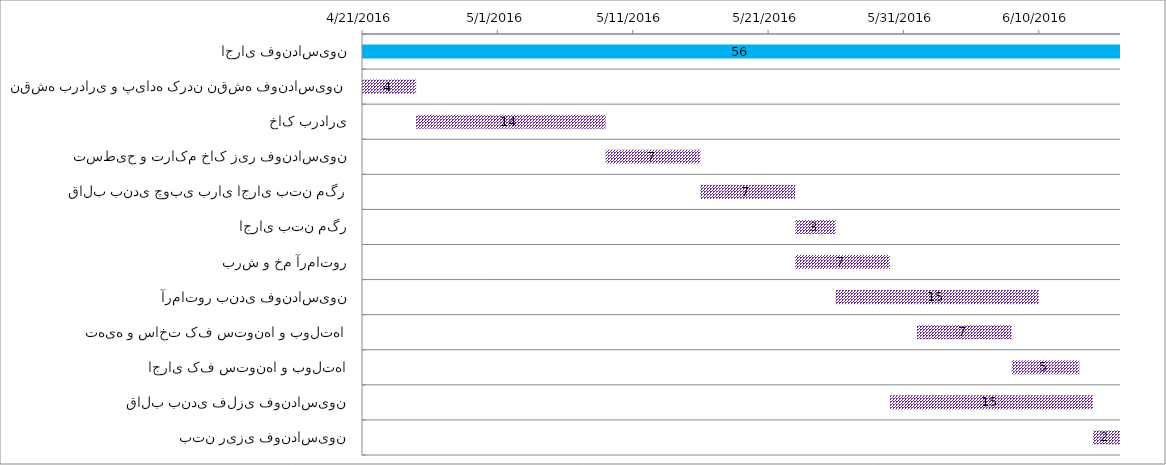
| Category | Series 0 | Series 1 |
|---|---|---|
| اجرای فونداسیون | 4/21/16 | 56 |
| نقشه برداری و پیاده کردن نقشه فونداسیون | 4/21/16 | 4 |
| خاک برداری | 4/25/16 | 14 |
| تسطیح و تراکم خاک زیر فونداسیون | 5/9/16 | 7 |
| قالب بندی چوبی برای اجرای بتن مگر | 5/16/16 | 7 |
| اجرای بتن مگر | 5/23/16 | 3 |
| برش و خم آرماتور | 5/23/16 | 7 |
| آرماتور بندی فونداسیون | 5/26/16 | 15 |
| تهیه و ساخت کف ستونها و بولتها | 6/1/16 | 7 |
| اجرای کف ستونها و بولتها | 6/8/16 | 5 |
| قالب بندی فلزی فونداسیون | 5/30/16 | 15 |
| بتن ریزی فونداسیون | 6/14/16 | 2 |